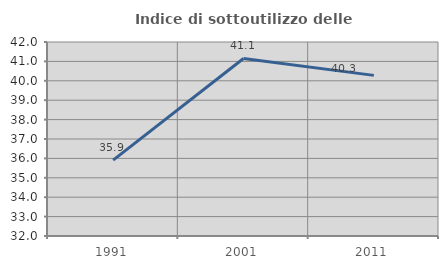
| Category | Indice di sottoutilizzo delle abitazioni  |
|---|---|
| 1991.0 | 35.91 |
| 2001.0 | 41.15 |
| 2011.0 | 40.28 |